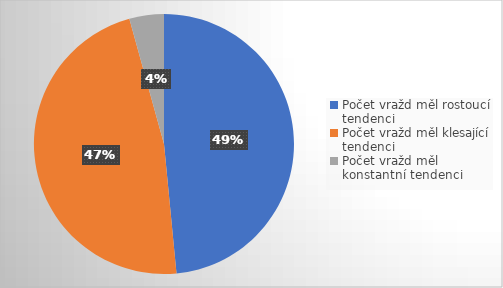
| Category | Series 0 |
|---|---|
| Počet vražd měl rostoucí tendenci | 79 |
| Počet vražd měl klesající tendenci | 77 |
| Počet vražd měl konstantní tendenci | 7 |